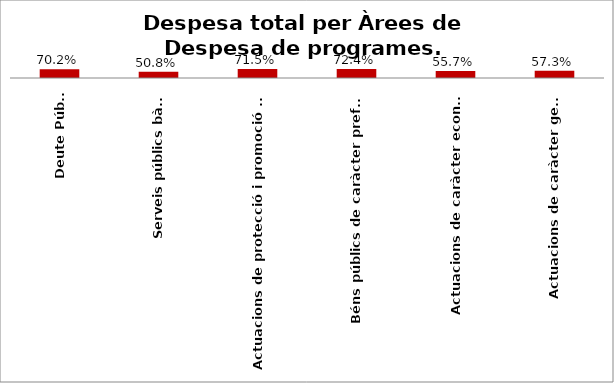
| Category | Series 0 |
|---|---|
| Deute Públic | 0.702 |
| Serveis públics bàsics | 0.508 |
| Actuacions de protecció i promoció social | 0.715 |
| Béns públics de caràcter preferent | 0.724 |
| Actuacions de caràcter econòmic | 0.557 |
| Actuacions de caràcter general | 0.573 |